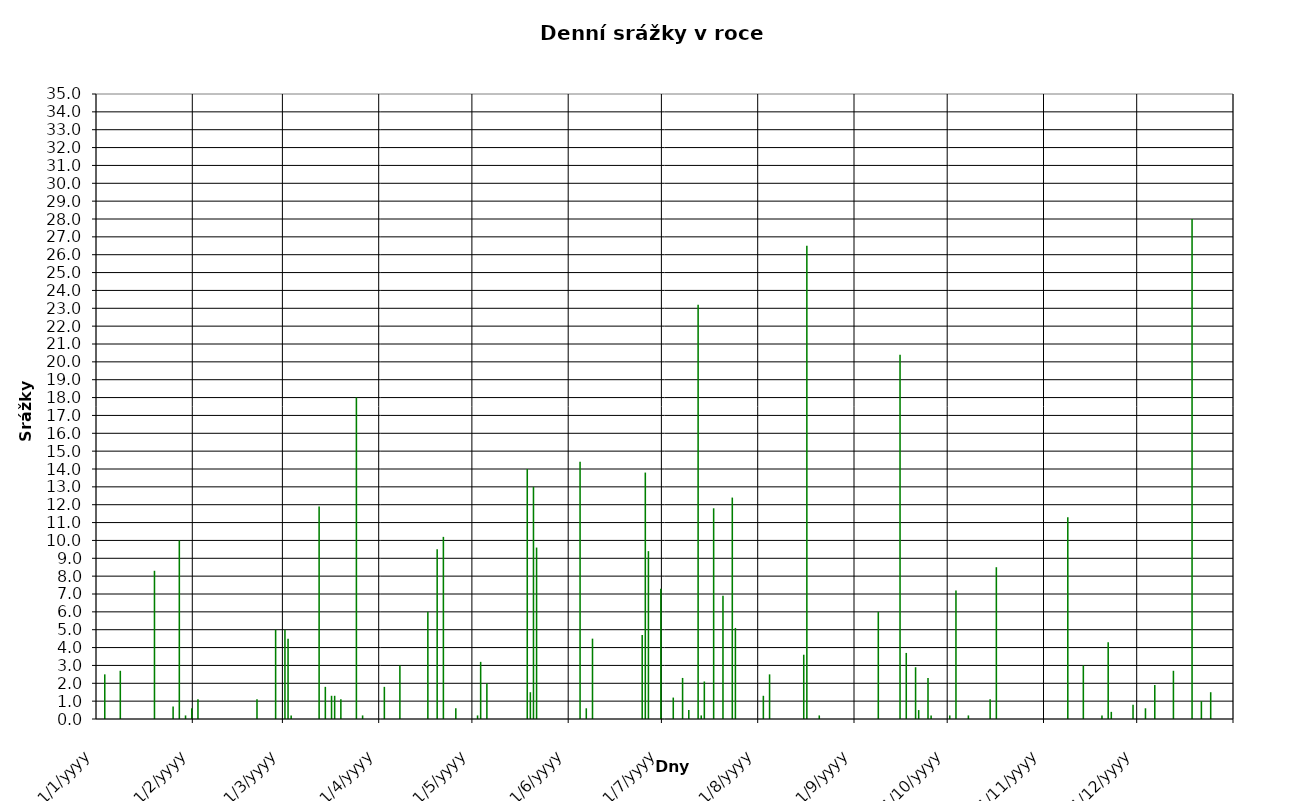
| Category | Series 0 |
|---|---|
| 2008-01-01 | 0 |
| 2008-01-02 | 0 |
| 2008-01-03 | 2.5 |
| 2008-01-04 | 0 |
| 2008-01-05 | 0 |
| 2008-01-06 | 0 |
| 2008-01-07 | 0 |
| 2008-01-08 | 2.7 |
| 2008-01-09 | 0 |
| 2008-01-10 | 0 |
| 2008-01-11 | 0 |
| 2008-01-12 | 0 |
| 2008-01-13 | 0 |
| 2008-01-14 | 0 |
| 2008-01-15 | 0 |
| 2008-01-16 | 0 |
| 2008-01-17 | 0 |
| 2008-01-18 | 0 |
| 2008-01-19 | 8.3 |
| 2008-01-20 | 0 |
| 2008-01-21 | 0 |
| 2008-01-22 | 0 |
| 2008-01-23 | 0 |
| 2008-01-24 | 0 |
| 2008-01-25 | 0.7 |
| 2008-01-26 | 0 |
| 2008-01-27 | 10 |
| 2008-01-28 | 0 |
| 2008-01-29 | 0.2 |
| 2008-01-30 | 0 |
| 2008-01-31 | 0.6 |
| 2008-02-01 | 0 |
| 2008-02-02 | 1.1 |
| 2008-02-03 | 0 |
| 2008-02-04 | 0 |
| 2008-02-05 | 0 |
| 2008-02-06 | 0 |
| 2008-02-07 | 0 |
| 2008-02-08 | 0 |
| 2008-02-09 | 0 |
| 2008-02-10 | 0 |
| 2008-02-11 | 0 |
| 2008-02-12 | 0 |
| 2008-02-13 | 0 |
| 2008-02-14 | 0 |
| 2008-02-15 | 0 |
| 2008-02-16 | 0 |
| 2008-02-17 | 0 |
| 2008-02-18 | 0 |
| 2008-02-19 | 0 |
| 2008-02-20 | 0 |
| 2008-02-21 | 1.1 |
| 2008-02-22 | 0 |
| 2008-02-23 | 0 |
| 2008-02-24 | 0 |
| 2008-02-25 | 0 |
| 2008-02-26 | 0 |
| 2008-02-27 | 5 |
| 2008-02-28 | 0 |
| 2008-02-29 | 0 |
| 2008-03-01 | 5 |
| 2008-03-02 | 4.5 |
| 2008-03-03 | 0.2 |
| 2008-03-04 | 0 |
| 2008-03-05 | 0 |
| 2008-03-06 | 0 |
| 2008-03-07 | 0 |
| 2008-03-08 | 0 |
| 2008-03-09 | 0 |
| 2008-03-10 | 0 |
| 2008-03-11 | 0 |
| 2008-03-12 | 11.9 |
| 2008-03-13 | 0 |
| 2008-03-14 | 1.8 |
| 2008-03-15 | 0 |
| 2008-03-16 | 1.3 |
| 2008-03-17 | 1.3 |
| 2008-03-18 | 0 |
| 2008-03-19 | 1.1 |
| 2008-03-20 | 0 |
| 2008-03-21 | 0 |
| 2008-03-22 | 0 |
| 2008-03-23 | 0 |
| 2008-03-24 | 18 |
| 2008-03-25 | 0 |
| 2008-03-26 | 0.2 |
| 2008-03-27 | 0 |
| 2008-03-28 | 0 |
| 2008-03-29 | 0 |
| 2008-03-30 | 0 |
| 2008-03-31 | 0 |
| 2008-04-01 | 0 |
| 2008-04-02 | 1.8 |
| 2008-04-03 | 0 |
| 2008-04-04 | 0 |
| 2008-04-05 | 0 |
| 2008-04-06 | 0 |
| 2008-04-07 | 3 |
| 2008-04-08 | 0 |
| 2008-04-09 | 0 |
| 2008-04-10 | 0 |
| 2008-04-11 | 0 |
| 2008-04-12 | 0 |
| 2008-04-13 | 0 |
| 2008-04-14 | 0 |
| 2008-04-15 | 0 |
| 2008-04-16 | 6 |
| 2008-04-17 | 0 |
| 2008-04-18 | 0 |
| 2008-04-19 | 9.5 |
| 2008-04-20 | 0 |
| 2008-04-21 | 10.2 |
| 2008-04-22 | 0 |
| 2008-04-23 | 0 |
| 2008-04-24 | 0 |
| 2008-04-25 | 0.6 |
| 2008-04-26 | 0 |
| 2008-04-27 | 0 |
| 2008-04-28 | 0 |
| 2008-04-29 | 0 |
| 2008-04-30 | 0 |
| 2008-05-01 | 0 |
| 2008-05-02 | 0.2 |
| 2008-05-03 | 3.2 |
| 2008-05-04 | 0 |
| 2008-05-05 | 2 |
| 2008-05-06 | 0 |
| 2008-05-07 | 0 |
| 2008-05-08 | 0 |
| 2008-05-09 | 0 |
| 2008-05-10 | 0 |
| 2008-05-11 | 0 |
| 2008-05-12 | 0 |
| 2008-05-13 | 0 |
| 2008-05-14 | 0 |
| 2008-05-15 | 0 |
| 2008-05-16 | 0 |
| 2008-05-17 | 0 |
| 2008-05-18 | 14 |
| 2008-05-19 | 1.5 |
| 2008-05-20 | 13 |
| 2008-05-21 | 9.6 |
| 2008-05-22 | 0 |
| 2008-05-23 | 0 |
| 2008-05-24 | 0 |
| 2008-05-25 | 0 |
| 2008-05-26 | 0 |
| 2008-05-27 | 0 |
| 2008-05-28 | 0 |
| 2008-05-29 | 0 |
| 2008-05-30 | 0 |
| 2008-05-31 | 0 |
| 2008-06-01 | 0 |
| 2008-06-02 | 0 |
| 2008-06-03 | 0 |
| 2008-06-04 | 14.4 |
| 2008-06-05 | 0 |
| 2008-06-06 | 0.6 |
| 2008-06-07 | 0 |
| 2008-06-08 | 4.5 |
| 2008-06-09 | 0 |
| 2008-06-10 | 0 |
| 2008-06-11 | 0 |
| 2008-06-12 | 0 |
| 2008-06-13 | 0 |
| 2008-06-14 | 0 |
| 2008-06-15 | 0 |
| 2008-06-16 | 0 |
| 2008-06-17 | 0 |
| 2008-06-18 | 0 |
| 2008-06-19 | 0 |
| 2008-06-20 | 0 |
| 2008-06-21 | 0 |
| 2008-06-22 | 0 |
| 2008-06-23 | 0 |
| 2008-06-24 | 4.7 |
| 2008-06-25 | 13.8 |
| 2008-06-26 | 9.4 |
| 2008-06-27 | 0 |
| 2008-06-28 | 0 |
| 2008-06-29 | 0 |
| 2008-06-30 | 7.3 |
| 2008-07-01 | 0 |
| 2008-07-02 | 0 |
| 2008-07-03 | 0 |
| 2008-07-04 | 1.2 |
| 2008-07-05 | 0 |
| 2008-07-06 | 0 |
| 2008-07-07 | 2.3 |
| 2008-07-08 | 0 |
| 2008-07-09 | 0.5 |
| 2008-07-10 | 0 |
| 2008-07-11 | 0 |
| 2008-07-12 | 23.2 |
| 2008-07-13 | 0.2 |
| 2008-07-14 | 2.1 |
| 2008-07-15 | 0 |
| 2008-07-16 | 0 |
| 2008-07-17 | 11.8 |
| 2008-07-18 | 0 |
| 2008-07-19 | 0 |
| 2008-07-20 | 6.9 |
| 2008-07-21 | 0 |
| 2008-07-22 | 0 |
| 2008-07-23 | 12.4 |
| 2008-07-24 | 5.1 |
| 2008-07-25 | 0 |
| 2008-07-26 | 0 |
| 2008-07-27 | 0 |
| 2008-07-28 | 0 |
| 2008-07-29 | 0 |
| 2008-07-30 | 0 |
| 2008-07-31 | 0 |
| 2008-08-01 | 0 |
| 2008-08-02 | 1.3 |
| 2008-08-03 | 0 |
| 2008-08-04 | 2.5 |
| 2008-08-05 | 0 |
| 2008-08-06 | 0 |
| 2008-08-07 | 0 |
| 2008-08-08 | 0 |
| 2008-08-09 | 0 |
| 2008-08-10 | 0 |
| 2008-08-11 | 0 |
| 2008-08-12 | 0 |
| 2008-08-13 | 0 |
| 2008-08-14 | 0 |
| 2008-08-15 | 3.6 |
| 2008-08-16 | 26.5 |
| 2008-08-17 | 0 |
| 2008-08-18 | 0 |
| 2008-08-19 | 0 |
| 2008-08-20 | 0.2 |
| 2008-08-21 | 0 |
| 2008-08-22 | 0 |
| 2008-08-23 | 0 |
| 2008-08-24 | 0 |
| 2008-08-25 | 0 |
| 2008-08-26 | 0 |
| 2008-08-27 | 0 |
| 2008-08-28 | 0 |
| 2008-08-29 | 0 |
| 2008-08-30 | 0 |
| 2008-08-31 | 0 |
| 2008-09-01 | 0 |
| 2008-09-02 | 0 |
| 2008-09-03 | 0 |
| 2008-09-04 | 0 |
| 2008-09-05 | 0 |
| 2008-09-06 | 0 |
| 2008-09-07 | 0 |
| 2008-09-08 | 6 |
| 2008-09-09 | 0 |
| 2008-09-10 | 0 |
| 2008-09-11 | 0 |
| 2008-09-12 | 0 |
| 2008-09-13 | 0 |
| 2008-09-14 | 0 |
| 2008-09-15 | 20.4 |
| 2008-09-16 | 0 |
| 2008-09-17 | 3.7 |
| 2008-09-18 | 0 |
| 2008-09-19 | 0 |
| 2008-09-20 | 2.9 |
| 2008-09-21 | 0.5 |
| 2008-09-22 | 0 |
| 2008-09-23 | 0 |
| 2008-09-24 | 2.3 |
| 2008-09-25 | 0.2 |
| 2008-09-26 | 0 |
| 2008-09-27 | 0 |
| 2008-09-28 | 0 |
| 2008-09-29 | 0 |
| 2008-09-30 | 0 |
| 2008-10-01 | 0.2 |
| 2008-10-02 | 0 |
| 2008-10-03 | 7.2 |
| 2008-10-04 | 0 |
| 2008-10-05 | 0 |
| 2008-10-06 | 0 |
| 2008-10-07 | 0.2 |
| 2008-10-08 | 0 |
| 2008-10-09 | 0 |
| 2008-10-10 | 0 |
| 2008-10-11 | 0 |
| 2008-10-12 | 0 |
| 2008-10-13 | 0 |
| 2008-10-14 | 1.1 |
| 2008-10-15 | 0 |
| 2008-10-16 | 8.5 |
| 2008-10-17 | 0 |
| 2008-10-18 | 0 |
| 2008-10-19 | 0 |
| 2008-10-20 | 0 |
| 2008-10-21 | 0 |
| 2008-10-22 | 0 |
| 2008-10-23 | 0 |
| 2008-10-24 | 0 |
| 2008-10-25 | 0 |
| 2008-10-26 | 0 |
| 2008-10-27 | 0 |
| 2008-10-28 | 0 |
| 2008-10-29 | 0 |
| 2008-10-30 | 0 |
| 2008-10-31 | 0 |
| 2008-11-01 | 0 |
| 2008-11-02 | 0 |
| 2008-11-03 | 0 |
| 2008-11-04 | 0 |
| 2008-11-05 | 0 |
| 2008-11-06 | 0 |
| 2008-11-07 | 0 |
| 2008-11-08 | 11.3 |
| 2008-11-09 | 0 |
| 2008-11-10 | 0 |
| 2008-11-11 | 0 |
| 2008-11-12 | 0 |
| 2008-11-13 | 3 |
| 2008-11-14 | 0 |
| 2008-11-15 | 0 |
| 2008-11-16 | 0 |
| 2008-11-17 | 0 |
| 2008-11-18 | 0 |
| 2008-11-19 | 0.2 |
| 2008-11-20 | 0 |
| 2008-11-21 | 4.3 |
| 2008-11-22 | 0.4 |
| 2008-11-23 | 0 |
| 2008-11-24 | 0 |
| 2008-11-25 | 0 |
| 2008-11-26 | 0 |
| 2008-11-27 | 0 |
| 2008-11-28 | 0 |
| 2008-11-29 | 0.8 |
| 2008-11-30 | 0 |
| 2008-12-01 | 0 |
| 2008-12-02 | 0 |
| 2008-12-03 | 0.6 |
| 2008-12-04 | 0 |
| 2008-12-05 | 0 |
| 2008-12-06 | 1.9 |
| 2008-12-07 | 0 |
| 2008-12-08 | 0 |
| 2008-12-09 | 0 |
| 2008-12-10 | 0 |
| 2008-12-11 | 0 |
| 2008-12-12 | 2.7 |
| 2008-12-13 | 0 |
| 2008-12-14 | 0 |
| 2008-12-15 | 0 |
| 2008-12-16 | 0 |
| 2008-12-17 | 0 |
| 2008-12-18 | 28 |
| 2008-12-19 | 0 |
| 2008-12-20 | 0 |
| 2008-12-21 | 1 |
| 2008-12-22 | 0 |
| 2008-12-23 | 0 |
| 2008-12-24 | 1.5 |
| 2008-12-25 | 0 |
| 2008-12-26 | 0 |
| 2008-12-27 | 0 |
| 2008-12-28 | 0 |
| 2008-12-29 | 0 |
| 2008-12-30 | 0 |
| 2008-12-31 | 0 |